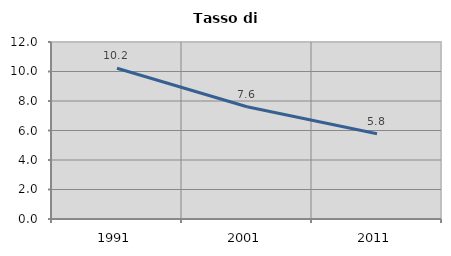
| Category | Tasso di disoccupazione   |
|---|---|
| 1991.0 | 10.223 |
| 2001.0 | 7.611 |
| 2011.0 | 5.775 |